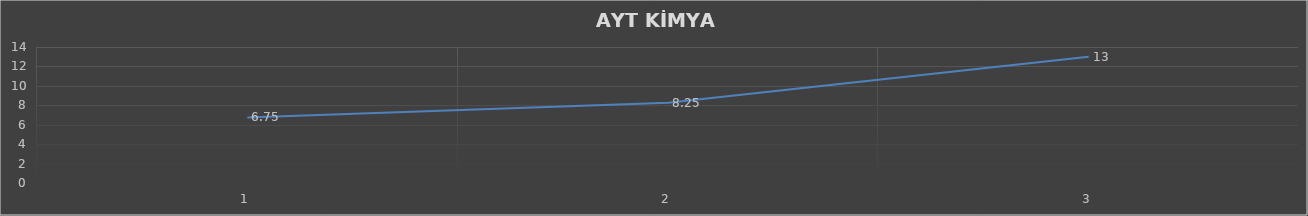
| Category | Series 0 |
|---|---|
| 0 | 6.75 |
| 1 | 8.25 |
| 2 | 13 |